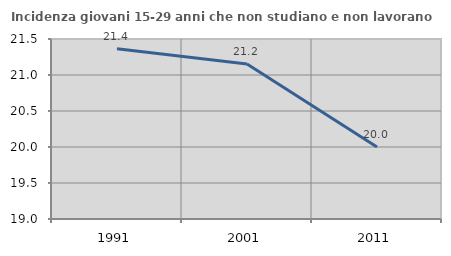
| Category | Incidenza giovani 15-29 anni che non studiano e non lavorano  |
|---|---|
| 1991.0 | 21.364 |
| 2001.0 | 21.154 |
| 2011.0 | 20 |